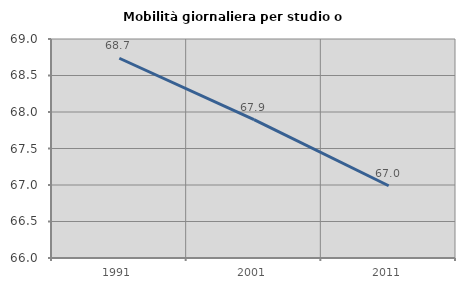
| Category | Mobilità giornaliera per studio o lavoro |
|---|---|
| 1991.0 | 68.736 |
| 2001.0 | 67.896 |
| 2011.0 | 66.99 |